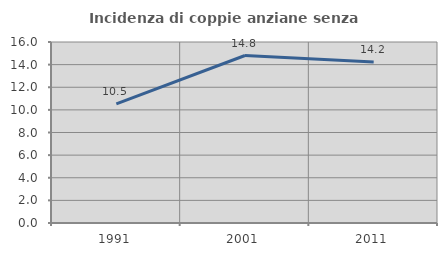
| Category | Incidenza di coppie anziane senza figli  |
|---|---|
| 1991.0 | 10.523 |
| 2001.0 | 14.806 |
| 2011.0 | 14.237 |